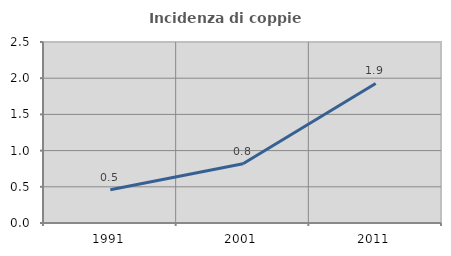
| Category | Incidenza di coppie miste |
|---|---|
| 1991.0 | 0.46 |
| 2001.0 | 0.819 |
| 2011.0 | 1.928 |